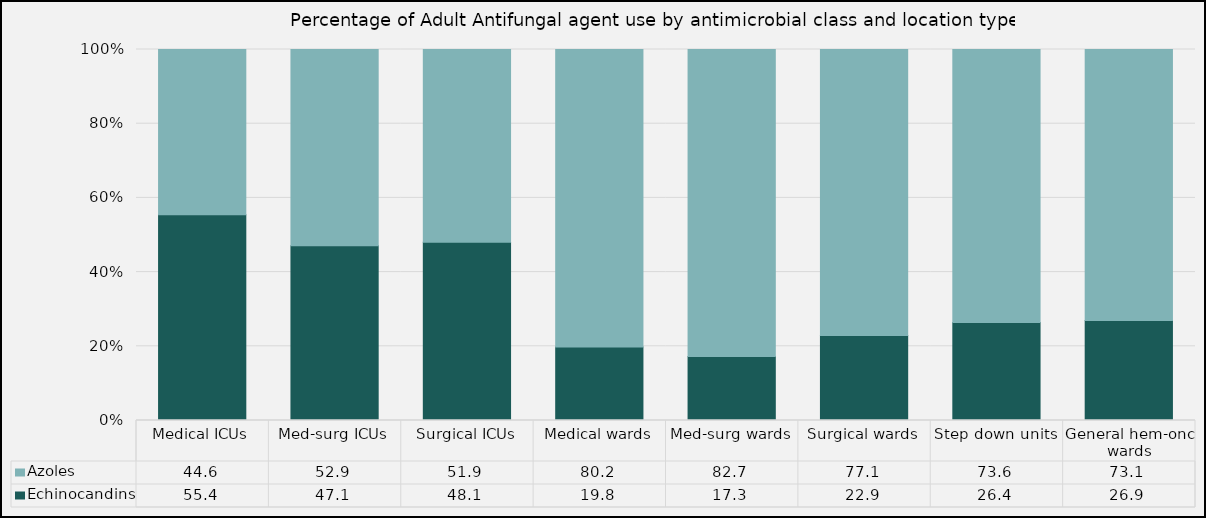
| Category | Echinocandins | Azoles |
|---|---|---|
| Medical ICUs | 55.44 | 44.56 |
| Med-surg ICUs | 47.09 | 52.91 |
| Surgical ICUs | 48.06 | 51.94 |
| Medical wards | 19.8 | 80.2 |
| Med-surg wards | 17.26 | 82.74 |
| Surgical wards | 22.91 | 77.09 |
| Step down units | 26.43 | 73.57 |
| General hem-onc wards | 26.94 | 73.06 |